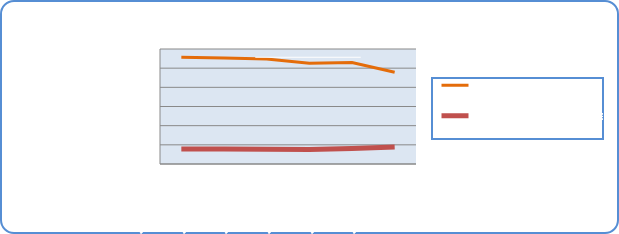
| Category | Motorin Türleri | Benzin Türleri |
|---|---|---|
| 12/9/19 | 55753528.005 | 7801275.536 |
| 12/10/19 | 55314576.968 | 7796740.872 |
| 12/11/19 | 54745613.908 | 7667363.892 |
| 12/12/19 | 52583702.98 | 7537375.799 |
| 12/13/19 | 52942567.464 | 8091379.112 |
| 12/14/19 | 47853936.348 | 8838384.106 |